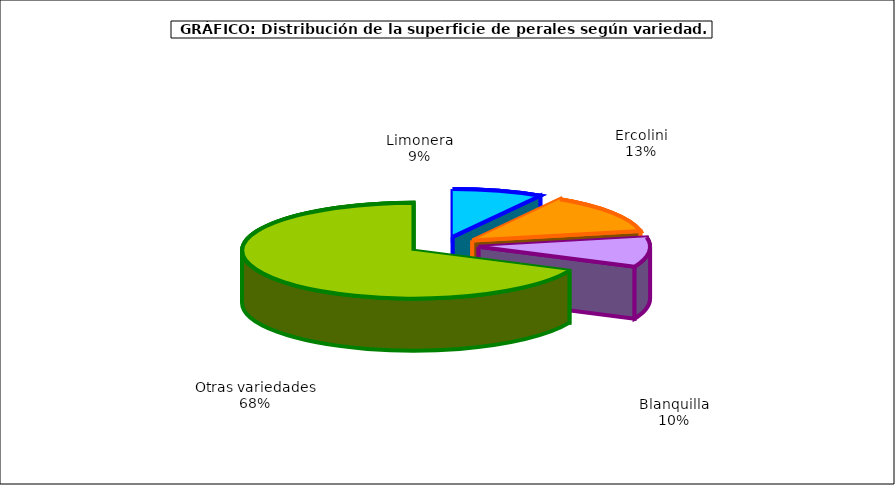
| Category | superficie |
|---|---|
| 0 | 1.631 |
| 1 | 2.541 |
| 2 | 1.909 |
| 3 | 13.032 |